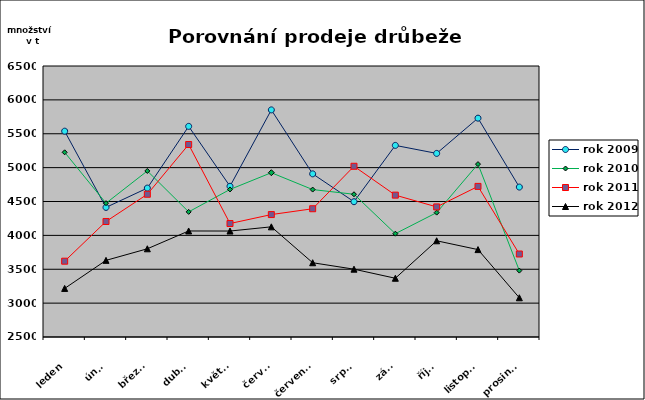
| Category | rok 2009 | rok 2010 | rok 2011 | rok 2012 |
|---|---|---|---|---|
| leden | 5538 | 5226 | 3619 | 3217 |
| únor | 4413 | 4475 | 4205 | 3631 |
| březen | 4698 | 4951 | 4607 | 3802 |
| duben | 5609 | 4347 | 5341 | 4065 |
| květen | 4725 | 4678 | 4175 | 4064 |
| červen | 5852 | 4925 | 4307 | 4126 |
| červenec | 4908 | 4676 | 4393 | 3596 |
| srpen | 4497 | 4607 | 5020 | 3501 |
| září | 5328 | 4025 | 4594 | 3367 |
| říjen | 5210 | 4336 | 4420 | 3920 |
| listopad | 5730 | 5052 | 4723 | 3790 |
| prosinec | 4713 | 3480 | 3725 | 3079 |